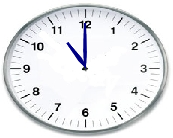
| Category | Series 0 |
|---|---|
| 0.0 | 0 |
| -0.15391536883141457 | 0.197 |
| -0.4499999999999998 | 0.779 |
| -0.09365164835397802 | 0.232 |
| 0.0 | 0 |
| -0.13979822586768667 | 0.207 |
| -0.4499999999999998 | 0.779 |
| -0.10959278669726938 | 0.225 |
| 0.0 | 0 |
| -0.017449748351250367 | 0.5 |
| 8.882326298087495e-17 | 1.45 |
| -0.008726203218641738 | 0.5 |
| 0.0 | 0 |
| 0.01744974835125054 | 0.5 |
| 8.882326298087495e-17 | 1.45 |
| 0.0087262032186418 | 0.5 |
| 0.0 | 0 |